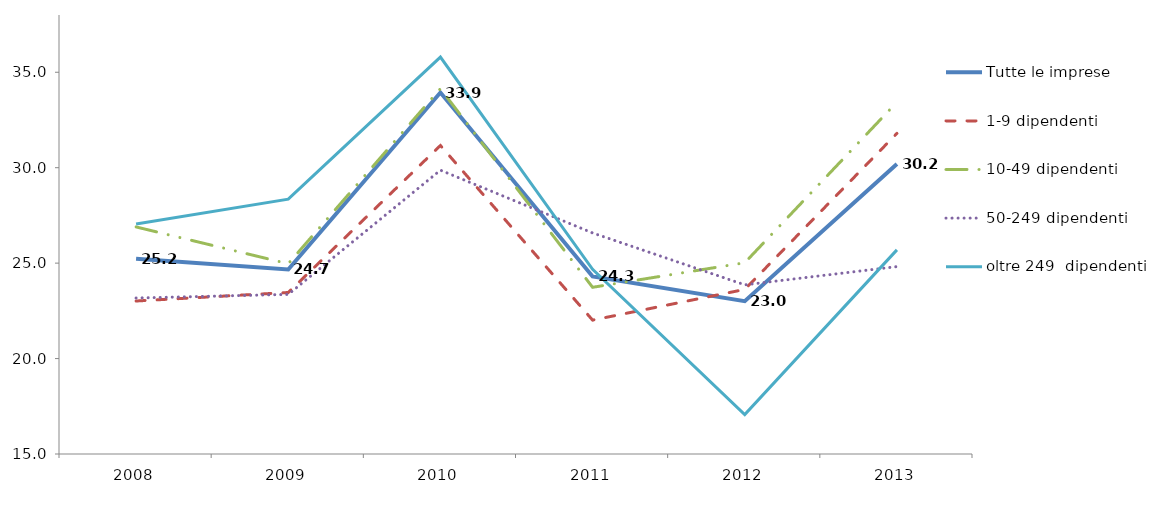
| Category | Tutte le imprese | 1-9 dipendenti | 10-49 dipendenti | 50-249 dipendenti | oltre 249  dipendenti |
|---|---|---|---|---|---|
| 2008.0 | 25.236 | 23.015 | 26.896 | 23.173 | 27.052 |
| 2009.0 | 24.668 | 23.462 | 24.969 | 23.362 | 28.352 |
| 2010.0 | 33.938 | 31.163 | 34.138 | 29.869 | 35.796 |
| 2011.0 | 24.301 | 22.015 | 23.734 | 26.582 | 24.679 |
| 2012.0 | 23.008 | 23.623 | 25.02 | 23.862 | 17.065 |
| 2013.0 | 30.196 | 31.797 | 33.433 | 24.818 | 25.694 |